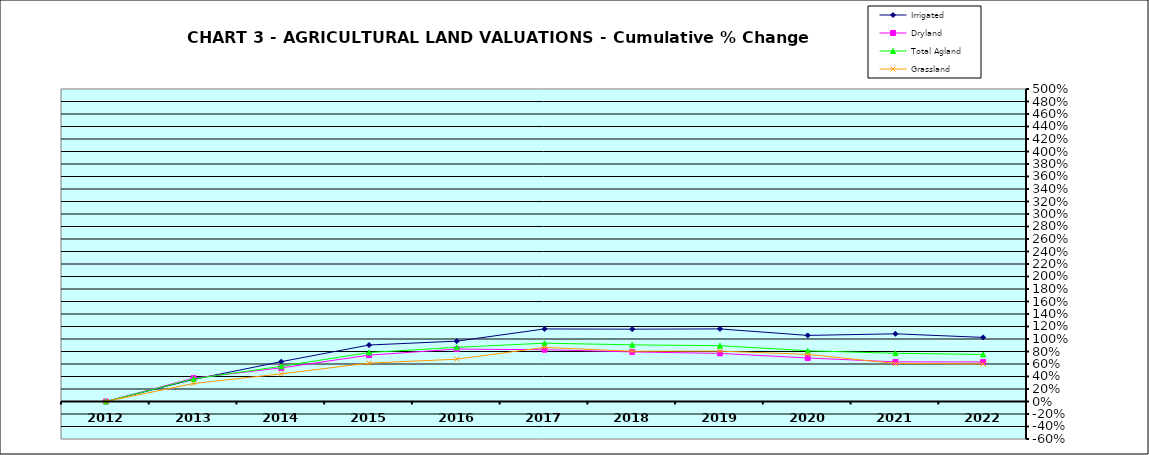
| Category | Irrigated | Dryland | Total Agland | Grassland |
|---|---|---|---|---|
| 2012.0 | 0 | 0 | 0 | 0 |
| 2013.0 | 0.353 | 0.374 | 0.362 | 0.288 |
| 2014.0 | 0.638 | 0.538 | 0.564 | 0.442 |
| 2015.0 | 0.904 | 0.741 | 0.784 | 0.614 |
| 2016.0 | 0.966 | 0.839 | 0.867 | 0.677 |
| 2017.0 | 1.161 | 0.829 | 0.933 | 0.865 |
| 2018.0 | 1.157 | 0.793 | 0.906 | 0.804 |
| 2019.0 | 1.161 | 0.77 | 0.893 | 0.806 |
| 2020.0 | 1.058 | 0.696 | 0.812 | 0.754 |
| 2021.0 | 1.083 | 0.634 | 0.772 | 0.609 |
| 2022.0 | 1.026 | 0.633 | 0.753 | 0.601 |